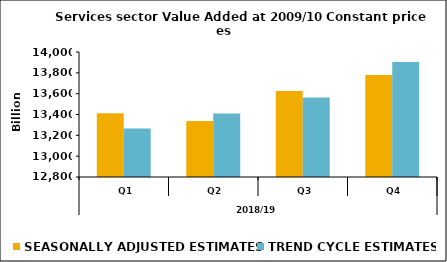
| Category | SEASONALLY ADJUSTED ESTIMATES | TREND CYCLE ESTIMATES |
|---|---|---|
| 0 | 13412.181 | 13264.863 |
| 1 | 13338.232 | 13410.461 |
| 2 | 13625.705 | 13564.063 |
| 3 | 13778.793 | 13904.42 |